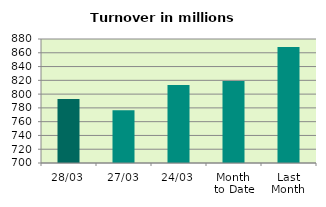
| Category | Series 0 |
|---|---|
| 28/03 | 792.849 |
| 27/03 | 776.437 |
| 24/03 | 813.263 |
| Month 
to Date | 818.981 |
| Last
Month | 868.35 |